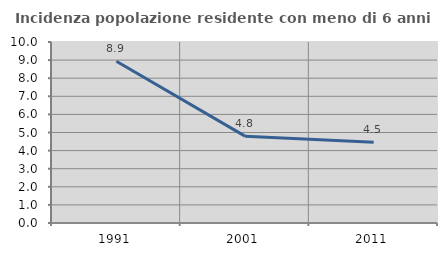
| Category | Incidenza popolazione residente con meno di 6 anni |
|---|---|
| 1991.0 | 8.935 |
| 2001.0 | 4.798 |
| 2011.0 | 4.463 |